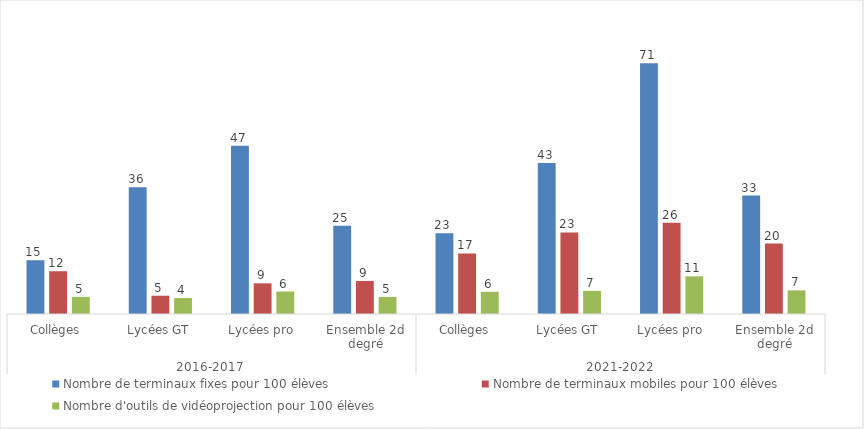
| Category | Nombre de terminaux fixes pour 100 élèves | Nombre de terminaux mobiles pour 100 élèves | Nombre d'outils de vidéoprojection pour 100 élèves |
|---|---|---|---|
| 0 | 15.135 | 12.05 | 4.824 |
| 1 | 35.695 | 5.145 | 4.48 |
| 2 | 47.386 | 8.642 | 6.33 |
| 3 | 24.889 | 9.313 | 4.809 |
| 4 | 22.781 | 17.044 | 6.25 |
| 5 | 42.53 | 22.979 | 6.521 |
| 6 | 70.644 | 25.691 | 10.604 |
| 7 | 33.376 | 19.842 | 6.656 |